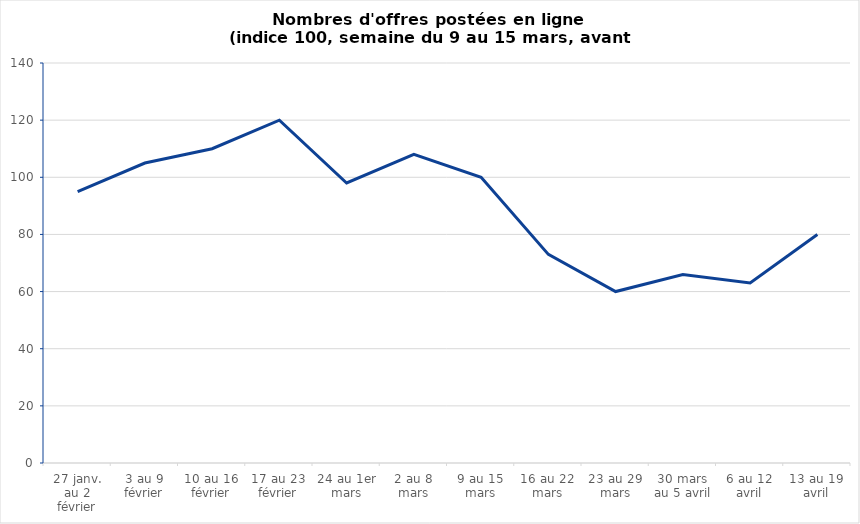
| Category | Series 0 |
|---|---|
| 27 janv. au 2 février | 95 |
| 3 au 9 février | 105 |
| 10 au 16 février | 110 |
| 17 au 23 février | 120 |
| 24 au 1er mars | 98 |
| 2 au 8 mars | 108 |
| 9 au 15 mars | 100 |
| 16 au 22 mars | 73 |
| 23 au 29 mars | 60 |
| 30 mars au 5 avril | 66 |
| 6 au 12 avril | 63 |
| 13 au 19 avril | 80 |